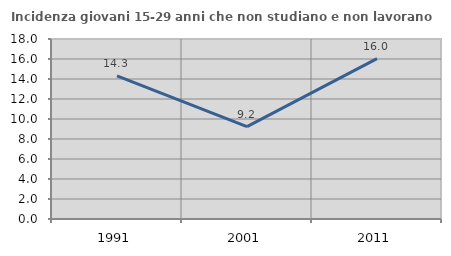
| Category | Incidenza giovani 15-29 anni che non studiano e non lavorano  |
|---|---|
| 1991.0 | 14.318 |
| 2001.0 | 9.244 |
| 2011.0 | 16.038 |